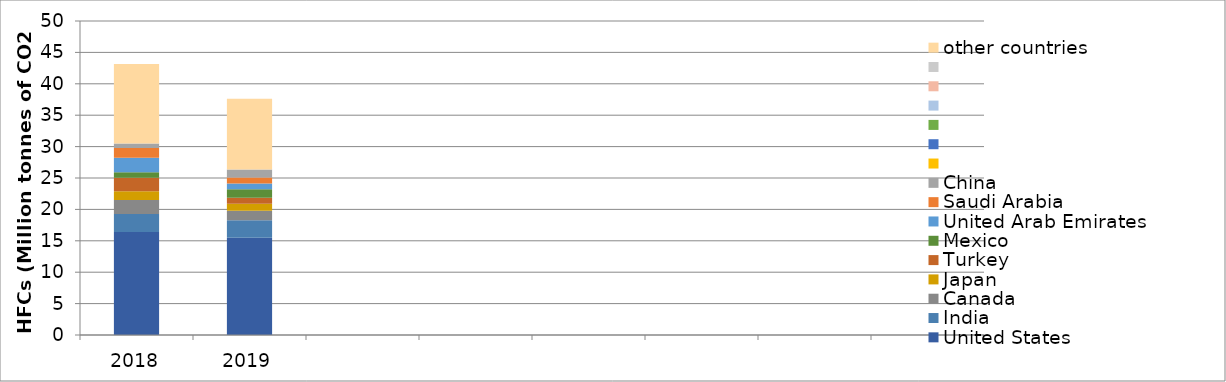
| Category | United States | India | Canada | Japan | Turkey | Mexico | United Arab Emirates | Saudi Arabia | China | #REF! | other countries |
|---|---|---|---|---|---|---|---|---|---|---|---|
| 2018.0 | 16.418 | 2.86 | 2.226 | 1.387 | 2.148 | 0.864 | 2.309 | 1.581 | 0.685 | 0 | 12.678 |
| 2019.0 | 15.473 | 2.803 | 1.521 | 1.12 | 0.955 | 1.334 | 0.926 | 0.952 | 1.253 | 0 | 11.294 |